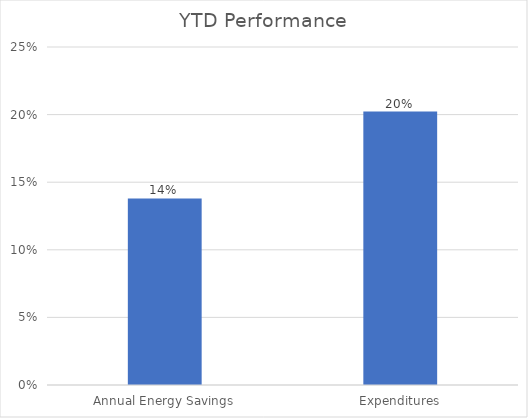
| Category | Series 0 |
|---|---|
| Annual Energy Savings | 0.138 |
| Expenditures | 0.202 |